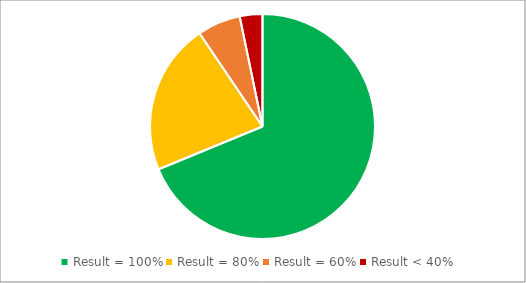
| Category | Series 0 |
|---|---|
| Result = 100% | 1141 |
| Result = 80% | 361 |
| Result = 60% | 103 |
| Result < 40% | 54 |